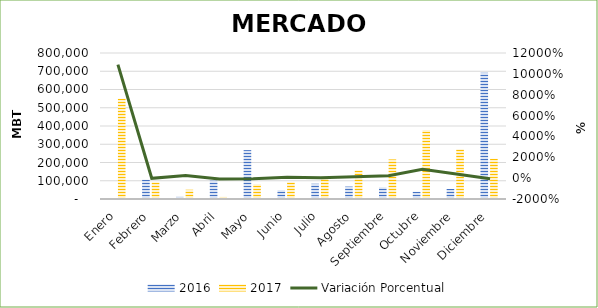
| Category | 2016 | 2017 |
|---|---|---|
| Enero | 5000 | 549405 |
| Febrero | 105500 | 91580 |
| Marzo | 14100 | 50896 |
| Abril | 100459 | 12000 |
| Mayo | 267700 | 80600 |
| Junio | 48000 | 91806 |
| Julio | 83640 | 121907 |
| Agosto | 68100 | 156325 |
| Septiembre | 63860 | 216965 |
| Octubre | 39545 | 377245 |
| Noviembre | 54814 | 272062 |
| Diciembre | 691759 | 220275 |